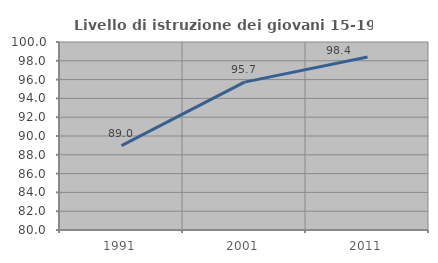
| Category | Livello di istruzione dei giovani 15-19 anni |
|---|---|
| 1991.0 | 88.973 |
| 2001.0 | 95.728 |
| 2011.0 | 98.403 |